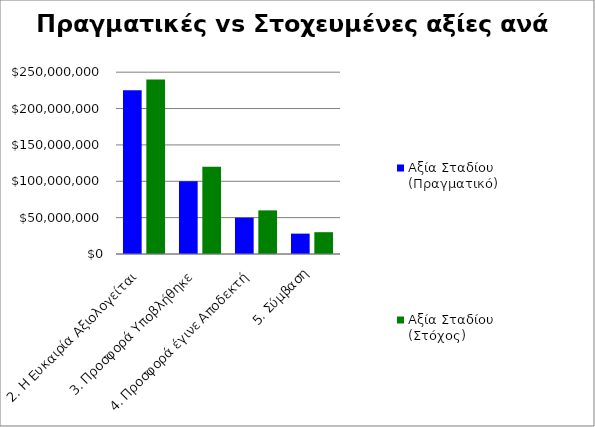
| Category | Αξία Σταδίου (Πραγματικό) | Αξία Σταδίου (Στόχος) |
|---|---|---|
| 2. Η Ευκαιρία Αξιολογείται | 225000000 | 240000000 |
| 3. Προσφορά Υποβλήθηκε | 100000000 | 120000000 |
| 4. Προσφορά έγινε Αποδεκτή | 50000000 | 60000000 |
| 5. Σύμβαση | 28000000 | 30000000 |